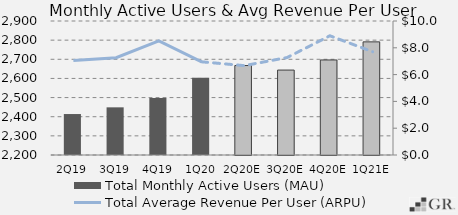
| Category | Total Monthly Active Users (MAU)  |
|---|---|
|  2Q19  | 2414 |
|  3Q19  | 2449 |
|  4Q19  | 2497.8 |
|  1Q20  | 2603 |
|  2Q20E  | 2667.35 |
|  3Q20E  | 2643.643 |
|  4Q20E  | 2696.442 |
|  1Q21E  | 2791.03 |